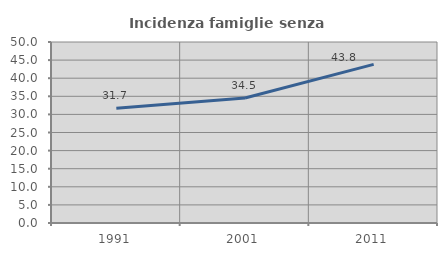
| Category | Incidenza famiglie senza nuclei |
|---|---|
| 1991.0 | 31.723 |
| 2001.0 | 34.51 |
| 2011.0 | 43.809 |